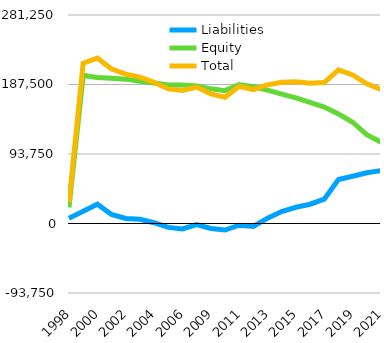
| Category | Liabilities  | Equity  | Total |
|---|---|---|---|
| 1998 | 7071 | 21754 | 28825 |
| 1999 | 16471 | 199754 | 216225 |
| 2000 | 26048 | 197097 | 223145 |
| 2001 | 12233 | 196086 | 208319 |
| 2002 | 6833 | 194714 | 201547 |
| 2003 | 5758 | 191784 | 197542 |
| 2004 | 1076 | 189462 | 190538 |
| 2005 | -5251 | 186794 | 181543 |
| 2006 | -7394 | 186895 | 179501 |
| 2007 | -1571 | 185579 | 184008 |
| 2009 | -6779 | 181629 | 174850 |
| 2010 | -8867 | 179249 | 170382 |
| 2011 | -2267 | 187469 | 185202 |
| 2012 | -3833 | 184529 | 180696 |
| 2013 | 7172 | 179878 | 187050 |
| 2014 | 16129 | 174417 | 190546 |
| 2015 | 21875 | 169449 | 191324 |
| 2016 | 26000 | 163349 | 189349 |
| 2017 | 32915 | 157136 | 190051 |
| 2018 | 59354 | 147848 | 207202 |
| 2019 | 63738 | 136591 | 200329 |
| 2020 | 68480 | 119874 | 188354 |
| 2021 | 71257 | 109602 | 180859 |